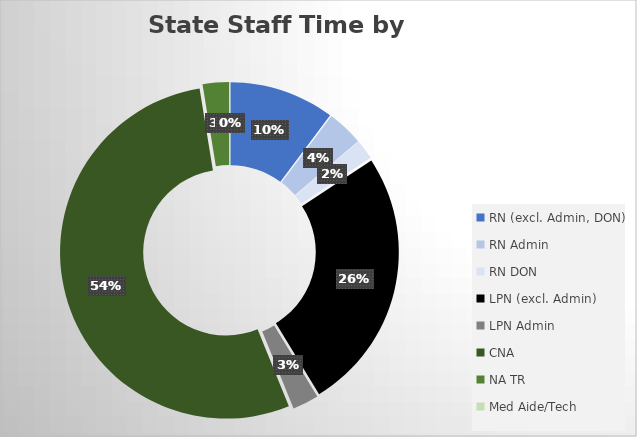
| Category | Series 0 |
|---|---|
| RN (excl. Admin, DON) | 5419.438 |
| RN Admin | 1866.222 |
| RN DON | 1027.978 |
| LPN (excl. Admin) | 13572.571 |
| LPN Admin | 1352.428 |
| CNA | 28386.611 |
| NA TR | 1357.546 |
| Med Aide/Tech | 5.492 |